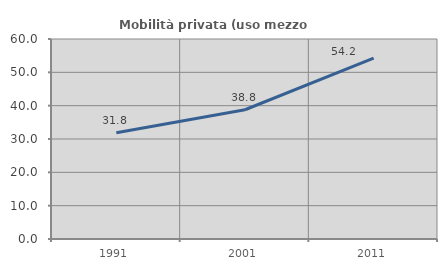
| Category | Mobilità privata (uso mezzo privato) |
|---|---|
| 1991.0 | 31.847 |
| 2001.0 | 38.776 |
| 2011.0 | 54.237 |